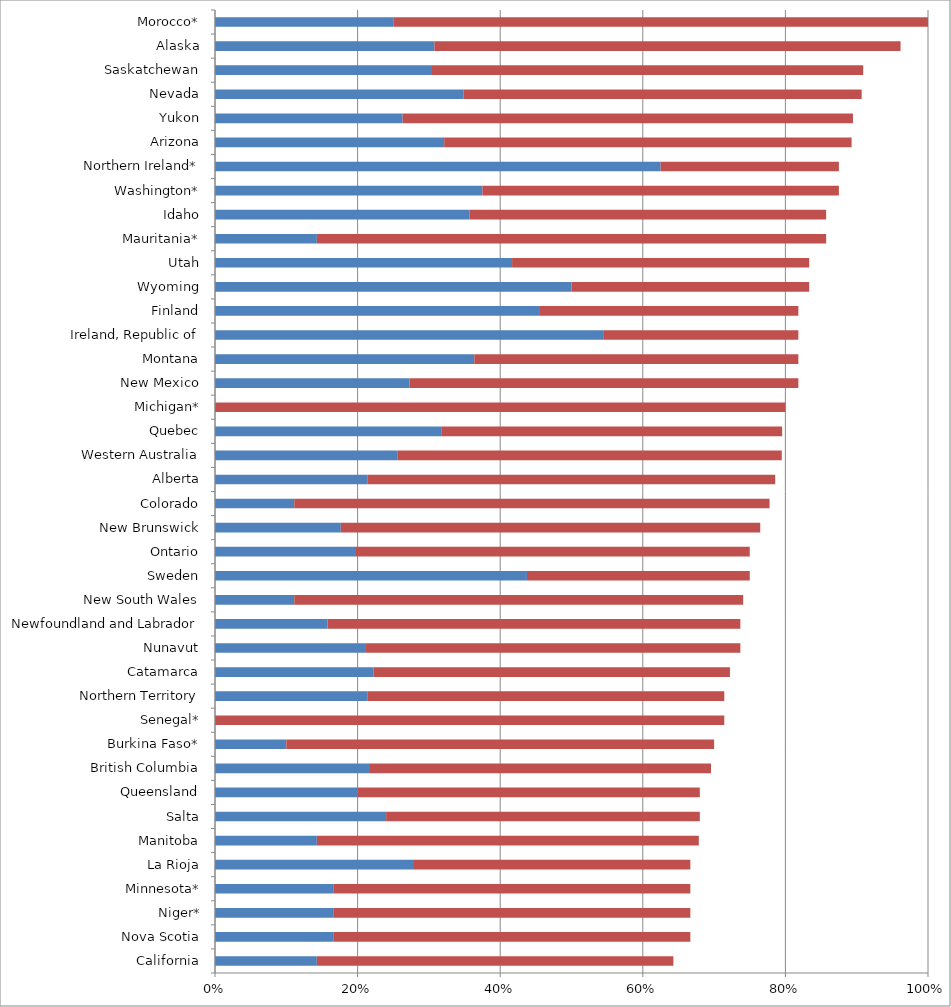
| Category | Series 0 | Series 1 |
|---|---|---|
| California | 0.143 | 0.5 |
| Nova Scotia | 0.167 | 0.5 |
| Niger* | 0.167 | 0.5 |
| Minnesota* | 0.167 | 0.5 |
| La Rioja | 0.278 | 0.389 |
| Manitoba | 0.143 | 0.536 |
| Salta | 0.24 | 0.44 |
| Queensland | 0.2 | 0.48 |
| British Columbia | 0.217 | 0.478 |
| Burkina Faso* | 0.1 | 0.6 |
| Senegal* | 0 | 0.714 |
| Northern Territory | 0.214 | 0.5 |
| Catamarca | 0.222 | 0.5 |
| Nunavut | 0.211 | 0.526 |
| Newfoundland and Labrador | 0.158 | 0.579 |
| New South Wales | 0.111 | 0.63 |
| Sweden | 0.438 | 0.312 |
| Ontario | 0.196 | 0.554 |
| New Brunswick | 0.176 | 0.588 |
| Colorado | 0.111 | 0.667 |
| Alberta | 0.214 | 0.571 |
| Western Australia | 0.256 | 0.538 |
| Quebec | 0.318 | 0.477 |
| Michigan* | 0 | 0.8 |
| New Mexico | 0.273 | 0.545 |
| Montana | 0.364 | 0.455 |
| Ireland, Republic of | 0.545 | 0.273 |
| Finland | 0.455 | 0.364 |
| Wyoming | 0.5 | 0.333 |
| Utah | 0.417 | 0.417 |
| Mauritania* | 0.143 | 0.714 |
| Idaho | 0.357 | 0.5 |
| Washington* | 0.375 | 0.5 |
| Northern Ireland* | 0.625 | 0.25 |
| Arizona | 0.321 | 0.571 |
| Yukon | 0.263 | 0.632 |
| Nevada | 0.349 | 0.558 |
| Saskatchewan | 0.303 | 0.606 |
| Alaska | 0.308 | 0.654 |
| Morocco* | 0.25 | 0.75 |